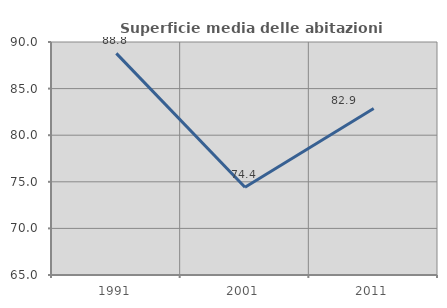
| Category | Superficie media delle abitazioni occupate |
|---|---|
| 1991.0 | 88.776 |
| 2001.0 | 74.423 |
| 2011.0 | 82.866 |